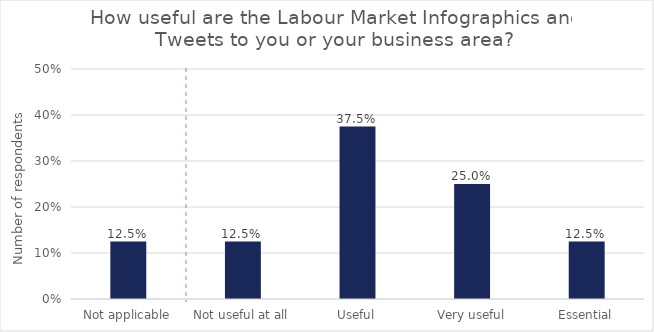
| Category | How useful are the Labour Market Infographics and Tweets to you or your business area? |
|---|---|
| Not applicable | 0.125 |
| Not useful at all | 0.125 |
| Useful | 0.375 |
| Very useful | 0.25 |
| Essential | 0.125 |